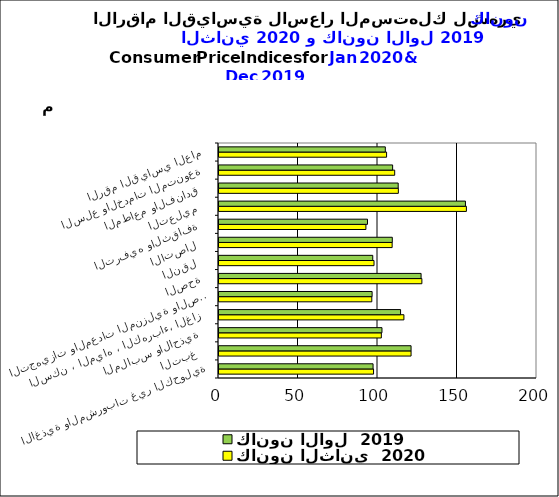
| Category | كانون الثاني  2020      | كانون الاول  2019      |
|---|---|---|
| الاغذية والمشروبات غير الكحولية | 97.2 | 96.9 |
|  التبغ | 120.8 | 120.8 |
| الملابس والاحذية | 102.1 | 102.5 |
| السكن ، المياه ، الكهرباء، الغاز  | 116.3 | 114.2 |
| التجهيزات والمعدات المنزلية والصيانة | 96.1 | 96.3 |
|  الصحة | 127.6 | 127.1 |
| النقل | 97.5 | 96.7 |
| الاتصال | 108.9 | 109 |
| الترفيه والثقافة | 92.4 | 93.4 |
| التعليم | 155.6 | 155 |
| المطاعم والفنادق | 112.8 | 112.7 |
|  السلع والخدمات المتنوعة | 110.5 | 109.2 |
| الرقم القياسي العام | 105.4 | 104.6 |